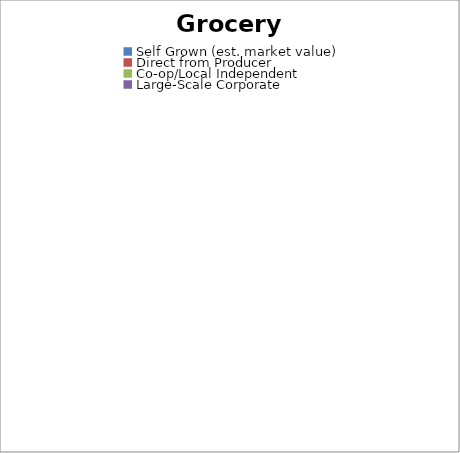
| Category | Series 0 |
|---|---|
| Self Grown (est. market value) | 0 |
| Direct from Producer | 0 |
| Co-op/Local Independent | 0 |
| Large-Scale Corporate | 0 |